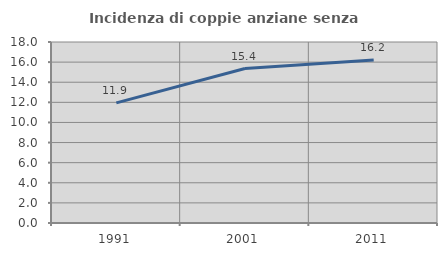
| Category | Incidenza di coppie anziane senza figli  |
|---|---|
| 1991.0 | 11.949 |
| 2001.0 | 15.364 |
| 2011.0 | 16.209 |